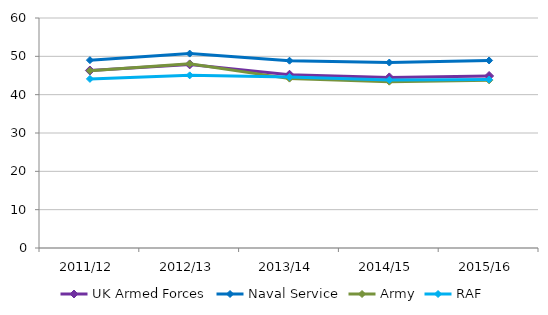
| Category | UK Armed Forces | Naval Service | Army | RAF |
|---|---|---|---|---|
| 2011/12 | 46.301 | 49.005 | 46.241 | 44.114 |
| 2012/13 | 47.899 | 50.718 | 48.066 | 45.039 |
| 2013/14 | 45.2 | 48.862 | 44.186 | 44.609 |
| 2014/15 | 44.503 | 48.381 | 43.392 | 43.826 |
| 2015/16 | 44.875 | 48.924 | 43.744 | 43.935 |